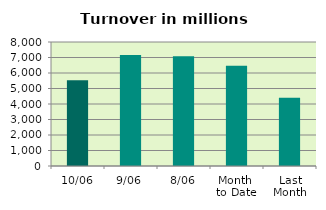
| Category | Series 0 |
|---|---|
| 10/06 | 5531.014 |
| 9/06 | 7160.745 |
| 8/06 | 7081.172 |
| Month 
to Date | 6466.769 |
| Last
Month | 4406.275 |